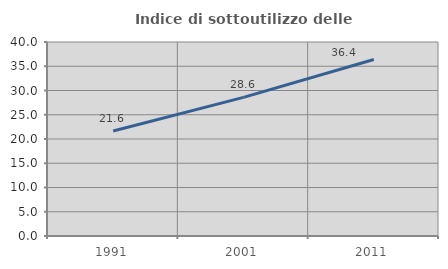
| Category | Indice di sottoutilizzo delle abitazioni  |
|---|---|
| 1991.0 | 21.637 |
| 2001.0 | 28.581 |
| 2011.0 | 36.404 |